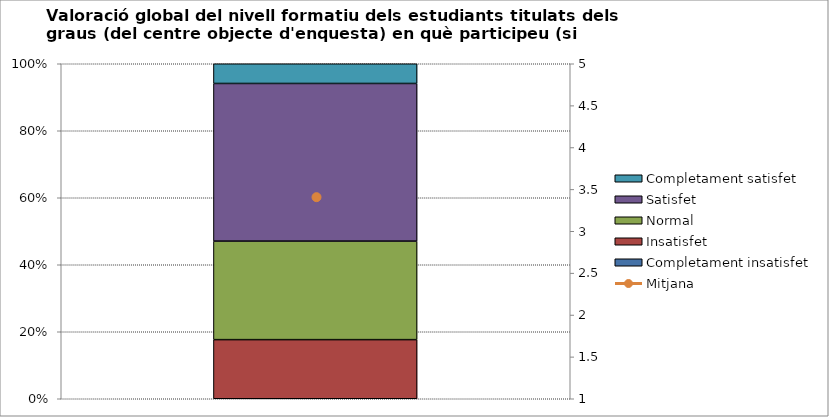
| Category | Completament insatisfet | Insatisfet | Normal | Satisfet | Completament satisfet |
|---|---|---|---|---|---|
| 0 | 0 | 3 | 5 | 8 | 1 |